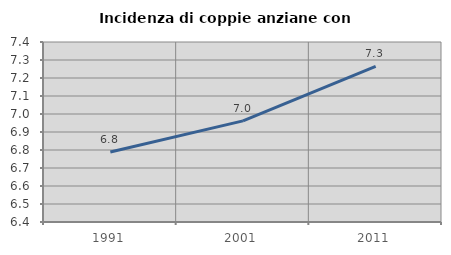
| Category | Incidenza di coppie anziane con figli |
|---|---|
| 1991.0 | 6.789 |
| 2001.0 | 6.962 |
| 2011.0 | 7.265 |